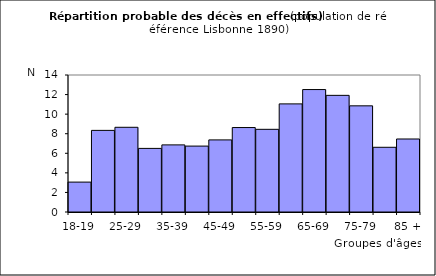
| Category | Series 0 |
|---|---|
| 18-19 | 3.056 |
| 20-24 | 8.34 |
| 25-29 | 8.657 |
| 30-34 | 6.5 |
| 35-39 | 6.858 |
| 40-44 | 6.736 |
| 45-49 | 7.369 |
| 50-54 | 8.631 |
| 55-59 | 8.45 |
| 60-64 | 11.049 |
| 65-69 | 12.512 |
| 70-74 | 11.921 |
| 75-79 | 10.848 |
| 80-84 | 6.613 |
| 85 + | 7.461 |